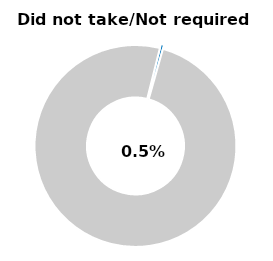
| Category | Series 0 |
|---|---|
| Did not take/not required | 0.005 |
| Other | 0.995 |